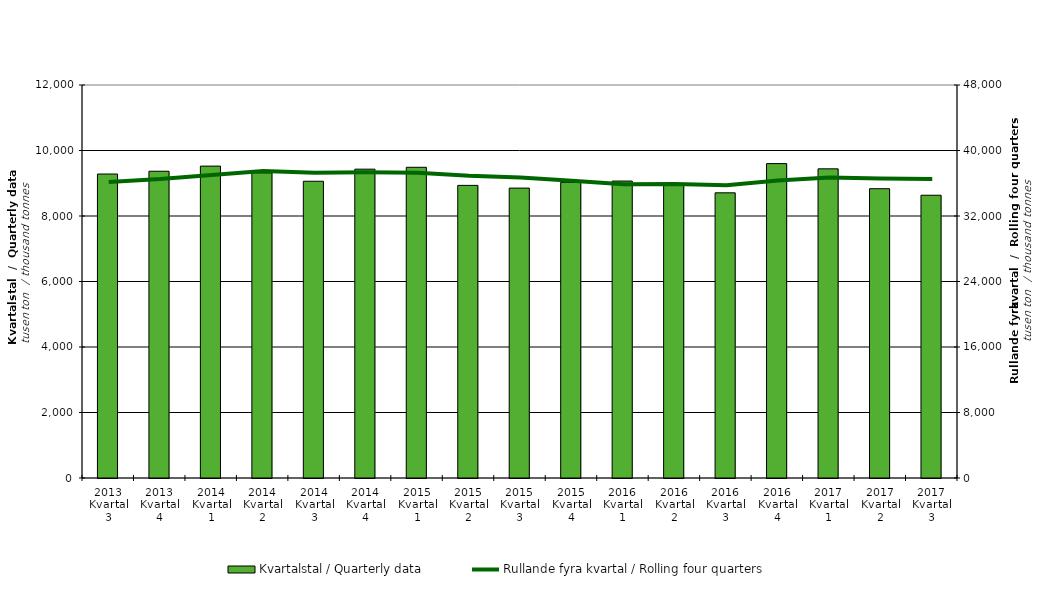
| Category | Kvartalstal / Quarterly data |
|---|---|
| 2013 Kvartal 3 | 9281.962 |
| 2013 Kvartal 4 | 9366.582 |
| 2014 Kvartal 1 | 9522.959 |
| 2014 Kvartal 2 | 9317.252 |
| 2014 Kvartal 3 | 9061.085 |
| 2014 Kvartal 4 | 9429.997 |
| 2015 Kvartal 1 | 9487.322 |
| 2015 Kvartal 2 | 8934.904 |
| 2015 Kvartal 3 | 8852.08 |
| 2015 Kvartal 4 | 9028.415 |
| 2016 Kvartal 1 | 9067.155 |
| 2016 Kvartal 2 | 8954.177 |
| 2016 Kvartal 3 | 8707.945 |
| 2016 Kvartal 4 | 9599.389 |
| 2017 Kvartal 1 | 9440.003 |
| 2017 Kvartal 2 | 8833.549 |
| 2017 Kvartal 3 | 8633.885 |